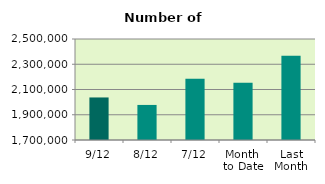
| Category | Series 0 |
|---|---|
| 9/12 | 2036982 |
| 8/12 | 1977722 |
| 7/12 | 2185936 |
| Month 
to Date | 2153625.429 |
| Last
Month | 2367033.455 |